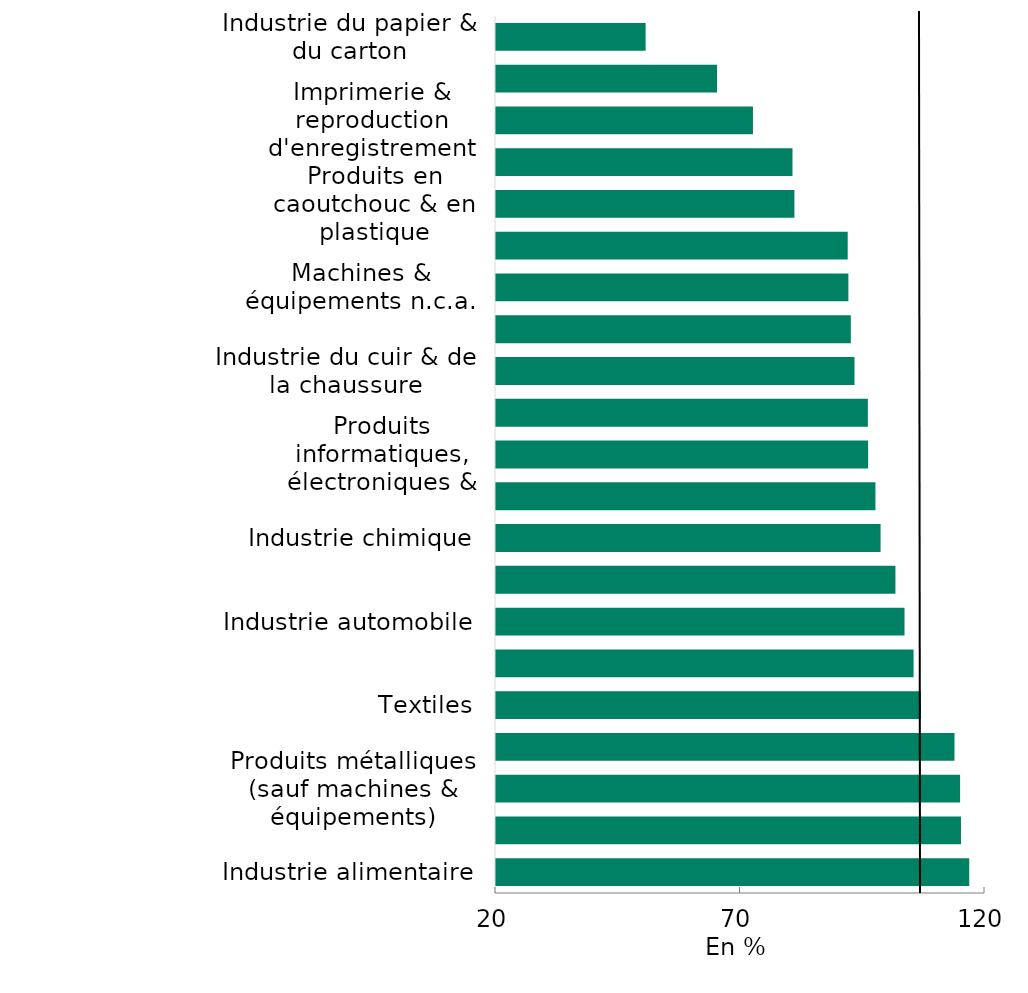
| Category | Series 0 |
|---|---|
| Industrie alimentaire | 116.98 |
| Industrie de l'habillement | 115.292 |
| Produits métalliques (sauf machines & équipements) | 115.112 |
| Autres produits minéraux non métalliques | 113.966 |
| Textiles | 107.11 |
| Métallurgie | 105.596 |
| Industrie automobile | 103.747 |
| Articles en bois (sauf meubles) | 101.888 |
| Industrie chimique | 98.853 |
| Réparation & installation de machines & d'équipements | 97.798 |
| Produits informatiques, électroniques & optiques | 96.305 |
| Autres matériels de transport | 96.253 |
| Industrie du cuir & de la chaussure | 93.517 |
| Équipements électriques | 92.767 |
| Machines & équipements n.c.a. | 92.268 |
| Autres industries manufacturières | 92.126 |
| Produits en caoutchouc & en plastique | 81.23 |
| Industrie pharmaceutique | 80.839 |
| Imprimerie & reproduction d'enregistrement | 72.752 |
| Collecte, traitement & élimination des déchets | 65.405 |
| Industrie du papier & du carton | 50.802 |